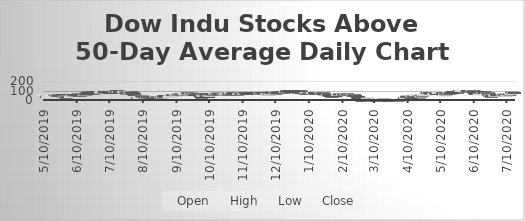
| Category | Open | High | Low | Close |
|---|---|---|---|---|
| 5/10/19 | 46.66 | 56.66 | 36.66 | 53.33 |
| 5/13/19 | 40 | 40 | 30 | 33.33 |
| 5/14/19 | 36.66 | 43.33 | 36.66 | 40 |
| 5/15/19 | 33.33 | 43.33 | 33.33 | 36.66 |
| 5/16/19 | 43.33 | 53.33 | 43.33 | 46.66 |
| 5/17/19 | 43.33 | 56.66 | 43.33 | 56.66 |
| 5/20/19 | 53.33 | 56.66 | 46.66 | 56.66 |
| 5/21/19 | 56.66 | 60 | 53.33 | 53.33 |
| 5/22/19 | 56.66 | 60 | 56.66 | 60 |
| 5/23/19 | 50 | 50 | 46.66 | 50 |
| 5/24/19 | 53.33 | 53.33 | 53.33 | 53.33 |
| 5/28/19 | 56.66 | 56.66 | 43.33 | 43.33 |
| 5/29/19 | 43.33 | 43.33 | 36.66 | 40 |
| 5/30/19 | 36.66 | 40 | 33.33 | 40 |
| 5/31/19 | 33.33 | 36.66 | 30 | 33.33 |
| 6/3/19 | 36.66 | 36.66 | 23.33 | 26.66 |
| 6/4/19 | 26.66 | 36.66 | 26.66 | 36.66 |
| 6/5/19 | 36.66 | 43.33 | 36.66 | 43.33 |
| 6/6/19 | 43.33 | 53.33 | 40 | 50 |
| 6/7/19 | 53.33 | 56.66 | 50 | 50 |
| 6/10/19 | 56.66 | 60 | 53.33 | 56.66 |
| 6/11/19 | 60 | 60 | 50 | 60 |
| 6/12/19 | 50 | 56.66 | 50 | 50 |
| 6/13/19 | 56.66 | 63.33 | 53.33 | 56.66 |
| 6/14/19 | 56.66 | 56.66 | 53.33 | 53.33 |
| 6/17/19 | 53.33 | 63.33 | 53.33 | 56.66 |
| 6/18/19 | 63.33 | 80 | 63.33 | 63.33 |
| 6/19/19 | 70 | 73.33 | 63.33 | 70 |
| 6/20/19 | 80 | 80 | 70 | 73.33 |
| 6/21/19 | 80 | 86.66 | 76.66 | 76.66 |
| 6/24/19 | 80 | 80 | 76.66 | 80 |
| 6/25/19 | 76.66 | 80 | 73.33 | 76.66 |
| 6/26/19 | 76.66 | 80 | 70 | 73.33 |
| 6/27/19 | 80 | 80 | 70 | 73.33 |
| 6/28/19 | 83.33 | 83.33 | 70 | 80 |
| 7/1/19 | 86.66 | 86.66 | 76.66 | 80 |
| 7/2/19 | 73.33 | 86.66 | 73.33 | 83.33 |
| 7/3/19 | 86.66 | 93.33 | 83.33 | 93.33 |
| 7/5/19 | 90 | 90 | 83.33 | 90 |
| 7/8/19 | 86.66 | 86.66 | 86.66 | 86.66 |
| 7/9/19 | 83.33 | 83.33 | 83.33 | 83.33 |
| 7/10/19 | 83.33 | 86.66 | 83.33 | 83.33 |
| 7/11/19 | 83.33 | 90 | 83.33 | 83.33 |
| 7/12/19 | 83.33 | 83.33 | 83.33 | 83.33 |
| 7/15/19 | 86.66 | 93.33 | 86.66 | 93.33 |
| 7/16/19 | 93.33 | 93.33 | 90 | 90 |
| 7/17/19 | 96.66 | 96.66 | 86.66 | 90 |
| 7/18/19 | 86.66 | 90 | 83.33 | 90 |
| 7/19/19 | 90 | 90 | 86.66 | 86.66 |
| 7/22/19 | 86.66 | 86.66 | 80 | 83.33 |
| 7/23/19 | 83.33 | 90 | 83.33 | 86.66 |
| 7/24/19 | 83.33 | 86.66 | 80 | 86.66 |
| 7/25/19 | 83.33 | 83.33 | 76.66 | 76.66 |
| 7/26/19 | 76.66 | 80 | 73.33 | 76.66 |
| 7/29/19 | 73.33 | 83.33 | 73.33 | 80 |
| 7/30/19 | 83.33 | 83.33 | 76.66 | 80 |
| 7/31/19 | 80 | 80 | 70 | 70 |
| 8/1/19 | 73.33 | 76.66 | 60 | 60 |
| 8/2/19 | 60 | 63.33 | 43.33 | 60 |
| 8/5/19 | 26.66 | 26.66 | 6.66 | 16.66 |
| 8/6/19 | 20 | 30 | 13.33 | 30 |
| 8/7/19 | 13.33 | 30 | 13.33 | 30 |
| 8/8/19 | 33.33 | 40 | 33.33 | 40 |
| 8/9/19 | 40 | 43.33 | 30 | 36.66 |
| 8/12/19 | 26.66 | 30 | 20 | 23.33 |
| 8/13/19 | 16.66 | 36.66 | 16.66 | 23.33 |
| 8/14/19 | 26.66 | 26.66 | 13.33 | 13.33 |
| 8/15/19 | 16.66 | 23.33 | 10 | 20 |
| 8/16/19 | 23.33 | 26.66 | 23.33 | 23.33 |
| 8/19/19 | 33.33 | 33.33 | 26.66 | 30 |
| 8/20/19 | 30 | 33.33 | 30 | 30 |
| 8/21/19 | 30 | 30 | 30 | 30 |
| 8/22/19 | 30 | 36.66 | 26.66 | 36.66 |
| 8/23/19 | 33.33 | 33.33 | 20 | 20 |
| 8/26/19 | 26.66 | 33.33 | 26.66 | 33.33 |
| 8/27/19 | 33.33 | 33.33 | 30 | 33.33 |
| 8/28/19 | 30 | 33.33 | 26.66 | 33.33 |
| 8/29/19 | 40 | 40 | 40 | 40 |
| 8/30/19 | 43.33 | 43.33 | 40 | 43.33 |
| 9/3/19 | 33.33 | 40 | 30 | 36.66 |
| 9/4/19 | 43.33 | 50 | 43.33 | 50 |
| 9/5/19 | 53.33 | 60 | 53.33 | 56.66 |
| 9/6/19 | 56.66 | 63.33 | 56.66 | 56.66 |
| 9/9/19 | 60 | 70 | 53.33 | 63.33 |
| 9/10/19 | 50 | 60 | 50 | 56.66 |
| 9/11/19 | 60 | 63.33 | 50 | 60 |
| 9/12/19 | 56.66 | 63.33 | 53.33 | 63.33 |
| 9/13/19 | 63.33 | 66.66 | 63.33 | 63.33 |
| 9/16/19 | 63.33 | 63.33 | 63.33 | 63.33 |
| 9/17/19 | 63.33 | 66.66 | 60 | 66.66 |
| 9/18/19 | 60 | 66.66 | 56.66 | 66.66 |
| 9/19/19 | 66.66 | 73.33 | 66.66 | 70 |
| 9/20/19 | 73.33 | 73.33 | 70 | 70 |
| 9/23/19 | 66.66 | 73.33 | 66.66 | 70 |
| 9/24/19 | 70 | 76.66 | 53.33 | 56.66 |
| 9/25/19 | 56.66 | 66.66 | 56.66 | 63.33 |
| 9/26/19 | 60 | 66.66 | 53.33 | 56.66 |
| 9/27/19 | 60 | 63.33 | 50 | 60 |
| 9/30/19 | 63.33 | 66.66 | 56.66 | 56.66 |
| 10/1/19 | 60 | 63.33 | 46.66 | 46.66 |
| 10/2/19 | 46.66 | 46.66 | 33.33 | 36.66 |
| 10/3/19 | 33.33 | 36.66 | 23.33 | 33.33 |
| 10/4/19 | 40 | 53.33 | 40 | 50 |
| 10/7/19 | 50 | 56.66 | 40 | 40 |
| 10/8/19 | 40 | 43.33 | 30 | 30 |
| 10/9/19 | 40 | 43.33 | 30 | 40 |
| 10/10/19 | 40 | 53.33 | 40 | 50 |
| 10/11/19 | 63.33 | 66.66 | 60 | 60 |
| 10/14/19 | 63.33 | 66.66 | 60 | 63.33 |
| 10/15/19 | 63.33 | 73.33 | 63.33 | 70 |
| 10/16/19 | 66.66 | 70 | 66.66 | 66.66 |
| 10/17/19 | 63.33 | 66.66 | 60 | 66.66 |
| 10/18/19 | 70 | 70 | 53.33 | 56.66 |
| 10/21/19 | 60 | 63.33 | 50 | 60 |
| 10/22/19 | 66.66 | 66.66 | 56.66 | 56.66 |
| 10/23/19 | 60 | 63.33 | 53.33 | 63.33 |
| 10/24/19 | 66.66 | 66.66 | 56.66 | 56.66 |
| 10/25/19 | 60 | 66.66 | 60 | 66.66 |
| 10/28/19 | 66.66 | 66.66 | 63.33 | 66.66 |
| 10/29/19 | 63.33 | 70 | 60 | 63.33 |
| 10/30/19 | 66.66 | 70 | 63.33 | 70 |
| 10/31/19 | 70 | 70 | 60 | 66.66 |
| 11/1/19 | 73.33 | 73.33 | 66.66 | 66.66 |
| 11/4/19 | 76.66 | 80 | 60 | 70 |
| 11/5/19 | 63.33 | 66.66 | 53.33 | 60 |
| 11/6/19 | 60 | 70 | 60 | 66.66 |
| 11/7/19 | 70 | 76.66 | 70 | 73.33 |
| 11/8/19 | 70 | 73.33 | 70 | 70 |
| 11/11/19 | 60 | 73.33 | 60 | 73.33 |
| 11/12/19 | 76.66 | 76.66 | 70 | 70 |
| 11/13/19 | 70 | 73.33 | 66.66 | 70 |
| 11/14/19 | 70 | 70 | 63.33 | 70 |
| 11/15/19 | 73.33 | 73.33 | 70 | 73.33 |
| 11/18/19 | 73.33 | 76.66 | 73.33 | 73.33 |
| 11/19/19 | 70 | 70 | 66.66 | 66.66 |
| 11/20/19 | 70 | 70 | 66.66 | 70 |
| 11/21/19 | 70 | 70 | 63.33 | 66.66 |
| 11/22/19 | 73.33 | 76.66 | 66.66 | 70 |
| 11/25/19 | 70 | 70 | 63.33 | 66.66 |
| 11/26/19 | 63.33 | 73.33 | 63.33 | 73.33 |
| 11/27/19 | 76.66 | 80 | 73.33 | 73.33 |
| 11/29/19 | 73.33 | 76.66 | 73.33 | 73.33 |
| 12/2/19 | 63.33 | 70 | 60 | 66.66 |
| 12/3/19 | 56.66 | 63.33 | 50 | 60 |
| 12/4/19 | 66.66 | 73.33 | 66.66 | 66.66 |
| 12/5/19 | 63.33 | 66.66 | 63.33 | 66.66 |
| 12/6/19 | 80 | 80 | 80 | 80 |
| 12/9/19 | 76.66 | 80 | 76.66 | 76.66 |
| 12/10/19 | 76.66 | 80 | 76.66 | 80 |
| 12/11/19 | 76.66 | 76.66 | 73.33 | 73.33 |
| 12/12/19 | 80 | 83.33 | 80 | 80 |
| 12/13/19 | 83.33 | 83.33 | 76.66 | 83.33 |
| 12/16/19 | 83.33 | 86.66 | 83.33 | 83.33 |
| 12/17/19 | 83.33 | 86.66 | 83.33 | 83.33 |
| 12/18/19 | 83.33 | 83.33 | 80 | 83.33 |
| 12/19/19 | 83.33 | 90 | 80 | 86.66 |
| 12/20/19 | 93.33 | 93.33 | 93.33 | 93.33 |
| 12/23/19 | 93.33 | 93.33 | 86.66 | 86.66 |
| 12/24/19 | 90 | 93.33 | 86.66 | 90 |
| 12/26/19 | 93.33 | 93.33 | 86.66 | 93.33 |
| 12/27/19 | 93.33 | 93.33 | 90 | 93.33 |
| 12/30/19 | 90 | 90 | 86.66 | 90 |
| 12/31/19 | 86.66 | 86.66 | 83.33 | 86.66 |
| 1/2/20 | 93.33 | 93.33 | 86.66 | 90 |
| 1/3/20 | 83.33 | 83.33 | 73.33 | 76.66 |
| 1/6/20 | 76.66 | 80 | 73.33 | 76.66 |
| 1/7/20 | 73.33 | 80 | 70 | 76.66 |
| 1/8/20 | 70 | 76.66 | 70 | 70 |
| 1/9/20 | 73.33 | 80 | 73.33 | 80 |
| 1/10/20 | 76.66 | 76.66 | 73.33 | 76.66 |
| 1/13/20 | 73.33 | 76.66 | 70 | 76.66 |
| 1/14/20 | 73.33 | 76.66 | 73.33 | 76.66 |
| 1/15/20 | 76.66 | 76.66 | 70 | 70 |
| 1/16/20 | 73.33 | 73.33 | 73.33 | 73.33 |
| 1/17/20 | 73.33 | 73.33 | 73.33 | 73.33 |
| 1/21/20 | 73.33 | 76.66 | 73.33 | 76.66 |
| 1/22/20 | 73.33 | 76.66 | 73.33 | 73.33 |
| 1/23/20 | 73.33 | 73.33 | 63.33 | 66.66 |
| 1/24/20 | 66.66 | 66.66 | 60 | 60 |
| 1/27/20 | 56.66 | 60 | 56.66 | 60 |
| 1/28/20 | 56.66 | 56.66 | 53.33 | 53.33 |
| 1/29/20 | 53.33 | 53.33 | 50 | 50 |
| 1/30/20 | 50 | 50 | 40 | 50 |
| 1/31/20 | 43.33 | 43.33 | 40 | 43.33 |
| 2/3/20 | 46.66 | 50 | 43.33 | 43.33 |
| 2/4/20 | 53.33 | 56.66 | 50 | 50 |
| 2/5/20 | 56.66 | 60 | 56.66 | 60 |
| 2/6/20 | 60 | 63.33 | 60 | 63.33 |
| 2/7/20 | 63.33 | 63.33 | 56.66 | 56.66 |
| 2/10/20 | 53.33 | 60 | 53.33 | 60 |
| 2/11/20 | 60 | 60 | 53.33 | 60 |
| 2/12/20 | 60 | 60 | 56.66 | 56.66 |
| 2/13/20 | 53.33 | 63.33 | 53.33 | 63.33 |
| 2/14/20 | 63.33 | 63.33 | 60 | 63.33 |
| 2/18/20 | 56.66 | 56.66 | 46.66 | 46.66 |
| 2/19/20 | 53.33 | 56.66 | 53.33 | 56.66 |
| 2/20/20 | 53.33 | 53.33 | 43.33 | 53.33 |
| 2/21/20 | 50 | 50 | 43.33 | 43.33 |
| 2/24/20 | 36.66 | 36.66 | 20 | 20 |
| 2/25/20 | 20 | 20 | 16.66 | 16.66 |
| 2/26/20 | 16.66 | 16.66 | 13.33 | 13.33 |
| 2/27/20 | 6.66 | 6.66 | 0.01 | 0.01 |
| 2/28/20 | 0.01 | 0.01 | 0.01 | 0.01 |
| 3/2/20 | 0.01 | 3.33 | 0.01 | 3.33 |
| 3/3/20 | 0.01 | 13.33 | 0.01 | 0.01 |
| 3/4/20 | 6.66 | 20 | 3.33 | 20 |
| 3/5/20 | 6.66 | 16.66 | 3.33 | 3.33 |
| 3/6/20 | 0.01 | 3.33 | 0.01 | 3.33 |
| 3/9/20 | 0.01 | 3.33 | 0.01 | 3.33 |
| 3/10/20 | 3.33 | 3.33 | 0.01 | 3.33 |
| 3/11/20 | 3.33 | 3.33 | 0.01 | 0.01 |
| 3/12/20 | 0.01 | 0.01 | 0.01 | 0.01 |
| 3/13/20 | 0.01 | 0.01 | 0.01 | 0.01 |
| 3/16/20 | 0.01 | 0.01 | 0.01 | 0.01 |
| 3/17/20 | 0.01 | 3.33 | 0.01 | 3.33 |
| 3/18/20 | 3.33 | 6.66 | 3.33 | 6.66 |
| 3/19/20 | 6.66 | 6.66 | 3.33 | 3.33 |
| 3/20/20 | 3.33 | 3.33 | 0.01 | 0.01 |
| 3/23/20 | 0.01 | 3.33 | 0.01 | 0.01 |
| 3/24/20 | 0.01 | 0.01 | 0.01 | 0.01 |
| 3/25/20 | 0.01 | 0.01 | 0.01 | 0.01 |
| 3/26/20 | 0.01 | 0.01 | 0.01 | 0.01 |
| 3/27/20 | 0.01 | 0.01 | 0.01 | 0.01 |
| 3/30/20 | 0.01 | 3.33 | 0.01 | 3.33 |
| 3/31/20 | 0.01 | 3.33 | 0.01 | 0.01 |
| 4/1/20 | 0.01 | 3.33 | 0.01 | 0.01 |
| 4/2/20 | 0.01 | 3.33 | 0.01 | 3.33 |
| 4/3/20 | 3.33 | 3.44 | 3.33 | 3.44 |
| 4/6/20 | 6.89 | 24.13 | 3.44 | 24.13 |
| 4/7/20 | 24.13 | 34.48 | 13.79 | 13.79 |
| 4/8/20 | 17.24 | 37.93 | 13.79 | 34.48 |
| 4/9/20 | 37.93 | 41.37 | 20.68 | 27.58 |
| 4/13/20 | 27.58 | 27.58 | 13.79 | 24.13 |
| 4/14/20 | 37.93 | 44.82 | 37.93 | 41.37 |
| 4/15/20 | 41.37 | 41.37 | 34.48 | 37.93 |
| 4/16/20 | 37.93 | 37.93 | 34.48 | 37.93 |
| 4/17/20 | 44.82 | 55.17 | 37.93 | 55.17 |
| 4/20/20 | 41.37 | 51.72 | 37.93 | 37.93 |
| 4/21/20 | 34.48 | 37.93 | 24.13 | 27.58 |
| 4/22/20 | 37.93 | 44.82 | 37.93 | 41.37 |
| 4/23/20 | 51.72 | 51.72 | 41.37 | 44.82 |
| 4/24/20 | 55.17 | 58.62 | 48.27 | 58.62 |
| 4/27/20 | 58.62 | 72.41 | 58.62 | 65.51 |
| 4/28/20 | 79.31 | 79.31 | 68.96 | 72.41 |
| 4/29/20 | 79.31 | 82.75 | 75.86 | 82.75 |
| 4/30/20 | 79.31 | 82.75 | 79.31 | 79.31 |
| 5/1/20 | 72.41 | 75.86 | 68.96 | 72.41 |
| 5/4/20 | 62.06 | 68.96 | 58.62 | 68.96 |
| 5/5/20 | 68.96 | 75.86 | 68.96 | 72.41 |
| 5/6/20 | 72.41 | 72.41 | 58.62 | 58.62 |
| 5/7/20 | 68.96 | 68.96 | 65.51 | 68.96 |
| 5/8/20 | 68.96 | 79.31 | 68.96 | 79.31 |
| 5/11/20 | 72.41 | 75.86 | 72.41 | 75.86 |
| 5/12/20 | 75.86 | 75.86 | 62.06 | 62.06 |
| 5/13/20 | 65.51 | 68.96 | 55.17 | 58.62 |
| 5/14/20 | 44.82 | 65.51 | 44.82 | 65.51 |
| 5/15/20 | 65.51 | 65.51 | 62.06 | 65.51 |
| 5/18/20 | 79.31 | 82.75 | 79.31 | 82.75 |
| 5/19/20 | 75.86 | 79.31 | 72.41 | 75.86 |
| 5/20/20 | 79.31 | 82.75 | 75.86 | 79.31 |
| 5/21/20 | 86.2 | 86.2 | 82.75 | 82.75 |
| 5/22/20 | 79.31 | 82.75 | 79.31 | 79.31 |
| 5/26/20 | 86.2 | 89.65 | 86.2 | 86.2 |
| 5/27/20 | 89.65 | 89.65 | 82.75 | 82.75 |
| 5/28/20 | 96.55 | 96.55 | 93.1 | 96.55 |
| 5/29/20 | 93.1 | 100 | 89.65 | 100 |
| 6/1/20 | 93.1 | 96.55 | 93.1 | 96.55 |
| 6/2/20 | 93.1 | 100 | 93.1 | 100 |
| 6/3/20 | 96.66 | 100 | 93.33 | 100 |
| 6/4/20 | 100 | 100 | 93.33 | 93.33 |
| 6/5/20 | 96.66 | 96.66 | 93.33 | 93.33 |
| 6/8/20 | 93.33 | 96.66 | 93.33 | 96.66 |
| 6/9/20 | 93.33 | 93.33 | 90 | 90 |
| 6/10/20 | 93.33 | 93.33 | 93.33 | 93.33 |
| 6/11/20 | 90 | 93.33 | 63.33 | 63.33 |
| 6/12/20 | 76.66 | 83.33 | 63.33 | 66.66 |
| 6/15/20 | 60 | 73.33 | 60 | 66.66 |
| 6/16/20 | 83.33 | 83.33 | 73.33 | 83.33 |
| 6/17/20 | 83.33 | 83.33 | 80 | 83.33 |
| 6/18/20 | 70 | 80 | 70 | 80 |
| 6/19/20 | 86.66 | 86.66 | 70 | 70 |
| 6/22/20 | 66.66 | 73.33 | 66.66 | 73.33 |
| 6/23/20 | 73.33 | 73.33 | 70 | 73.33 |
| 6/24/20 | 60 | 60 | 43.33 | 43.33 |
| 6/25/20 | 40 | 53.33 | 36.66 | 53.33 |
| 6/26/20 | 50 | 50 | 30 | 33.33 |
| 6/29/20 | 43.33 | 50 | 43.33 | 50 |
| 6/30/20 | 46.66 | 53.33 | 43.33 | 53.33 |
| 7/1/20 | 56.66 | 56.66 | 46.66 | 46.66 |
| 7/2/20 | 60 | 63.33 | 50 | 50 |
| 7/6/20 | 63.33 | 66.66 | 56.66 | 66.66 |
| 7/7/20 | 56.66 | 63.33 | 53.33 | 60 |
| 7/8/20 | 60 | 63.33 | 50 | 60 |
| 7/9/20 | 53.33 | 56.66 | 43.33 | 46.66 |
| 7/10/20 | 46.66 | 50 | 43.33 | 50 |
| 7/13/20 | 63.33 | 73.33 | 53.33 | 56.66 |
| 7/14/20 | 60 | 73.33 | 56.66 | 70 |
| 7/15/20 | 83.33 | 83.33 | 80 | 83.33 |
| 7/16/20 | 76.66 | 86.66 | 73.33 | 83.33 |
| 7/17/20 | 80 | 83.33 | 76.66 | 76.66 |